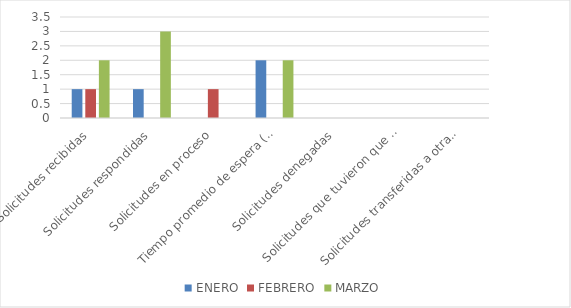
| Category | ENERO | FEBRERO | MARZO |
|---|---|---|---|
| Solicitudes recibidas | 1 | 1 | 2 |
| Solicitudes respondidas | 1 | 0 | 3 |
| Solicitudes en proceso | 0 | 1 | 0 |
| Tiempo promedio de espera (dias) | 2 | 0 | 2 |
| Solicitudes denegadas | 0 | 0 | 0 |
| Solicitudes que tuvieron que hacer prorrogas  | 0 | 0 | 0 |
| Solicitudes transferidas a otras instituciones  | 0 | 0 | 0 |